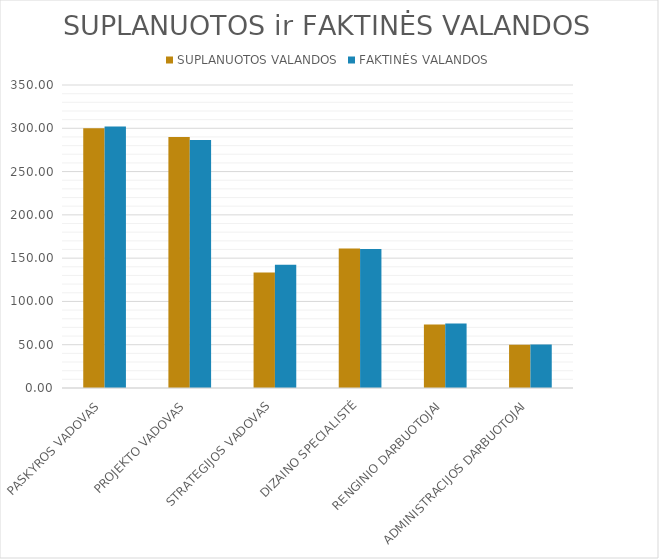
| Category | SUPLANUOTOS VALANDOS | FAKTINĖS VALANDOS |
|---|---|---|
| PASKYROS VADOVAS | 300 | 302 |
| PROJEKTO VADOVAS | 290 | 286.333 |
| STRATEGIJOS VADOVAS | 133.333 | 142.5 |
| DIZAINO SPECIALISTĖ | 161.111 | 160.556 |
| RENGINIO DARBUOTOJAI | 73.333 | 74.444 |
| ADMINISTRACIJOS DARBUOTOJAI | 50 | 50.333 |